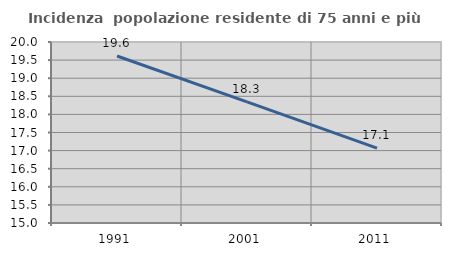
| Category | Incidenza  popolazione residente di 75 anni e più |
|---|---|
| 1991.0 | 19.614 |
| 2001.0 | 18.344 |
| 2011.0 | 17.069 |